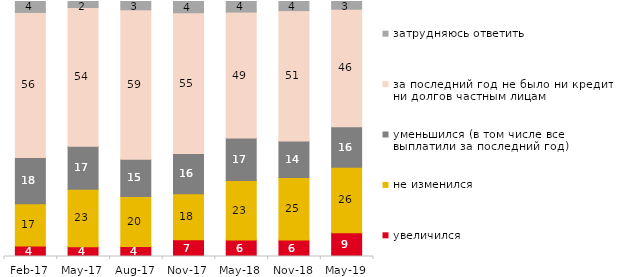
| Category | увеличился | не изменился | уменьшился (в том числе все выплатили за последний год) | за последний год не было ни кредитов, ни долгов частным лицам | затрудняюсь ответить |
|---|---|---|---|---|---|
| 2017-02-01 | 4.05 | 16.5 | 17.95 | 56.45 | 4.25 |
| 2017-05-01 | 3.85 | 22.5 | 16.9 | 54.35 | 2.35 |
| 2017-08-01 | 3.95 | 19.6 | 14.6 | 58.6 | 3.25 |
| 2017-11-01 | 6.6 | 18 | 15.8 | 55.2 | 4.4 |
| 2018-05-01 | 6.45 | 23.35 | 16.65 | 49.4 | 4.15 |
| 2018-11-01 | 6.437 | 24.501 | 14.371 | 51.098 | 3.593 |
| 2019-05-01 | 9.361 | 25.607 | 15.899 | 46.112 | 3.021 |